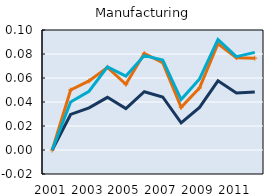
| Category | Series 0 | Series 1 | Series 2 |
|---|---|---|---|
| 2001.0 | 0 | 0 | 0 |
| 2002.0 | 0.05 | 0.03 | 0.04 |
| 2003.0 | 0.058 | 0.035 | 0.049 |
| 2004.0 | 0.069 | 0.044 | 0.069 |
| 2005.0 | 0.055 | 0.035 | 0.062 |
| 2006.0 | 0.08 | 0.049 | 0.079 |
| 2007.0 | 0.073 | 0.044 | 0.075 |
| 2008.0 | 0.036 | 0.023 | 0.042 |
| 2009.0 | 0.052 | 0.035 | 0.059 |
| 2010.0 | 0.089 | 0.058 | 0.092 |
| 2011.0 | 0.077 | 0.047 | 0.078 |
| 2012.0 | 0.077 | 0.048 | 0.081 |